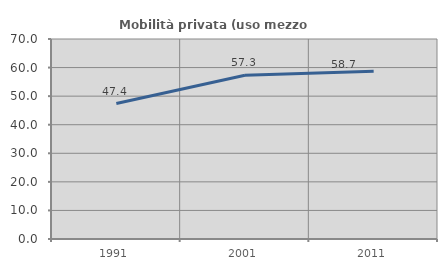
| Category | Mobilità privata (uso mezzo privato) |
|---|---|
| 1991.0 | 47.406 |
| 2001.0 | 57.295 |
| 2011.0 | 58.715 |